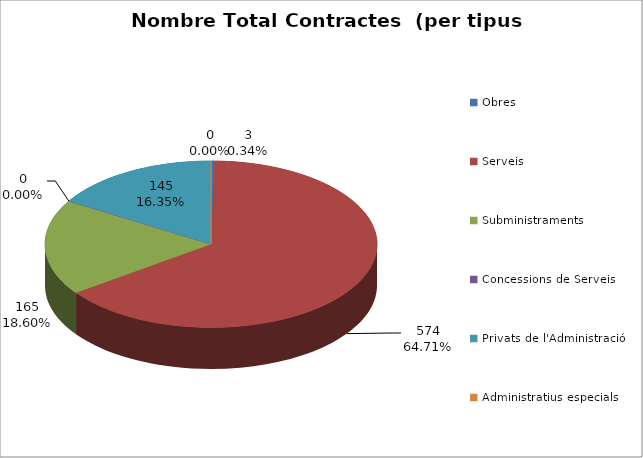
| Category | Nombre Total Contractes |
|---|---|
| Obres | 3 |
| Serveis | 574 |
| Subministraments | 165 |
| Concessions de Serveis | 0 |
| Privats de l'Administració | 145 |
| Administratius especials | 0 |